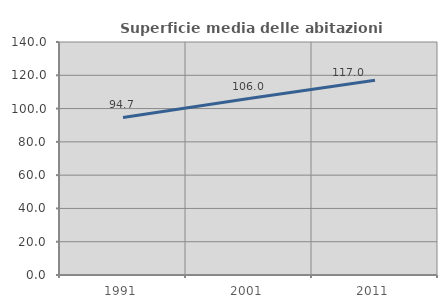
| Category | Superficie media delle abitazioni occupate |
|---|---|
| 1991.0 | 94.69 |
| 2001.0 | 105.996 |
| 2011.0 | 117.017 |